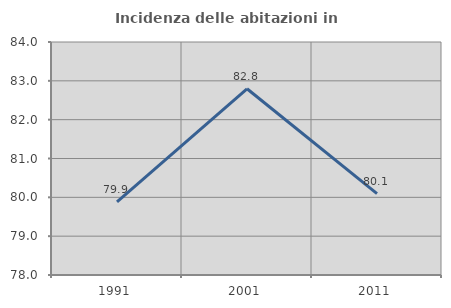
| Category | Incidenza delle abitazioni in proprietà  |
|---|---|
| 1991.0 | 79.882 |
| 2001.0 | 82.796 |
| 2011.0 | 80.095 |